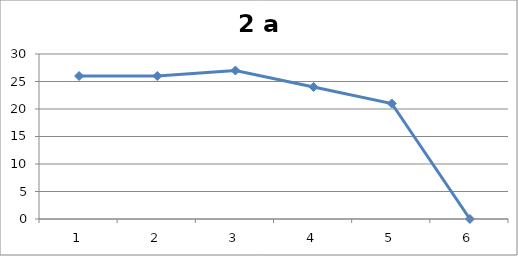
| Category | 4 класс |
|---|---|
| 0 | 26 |
| 1 | 26 |
| 2 | 27 |
| 3 | 24 |
| 4 | 21 |
| 5 | 0 |